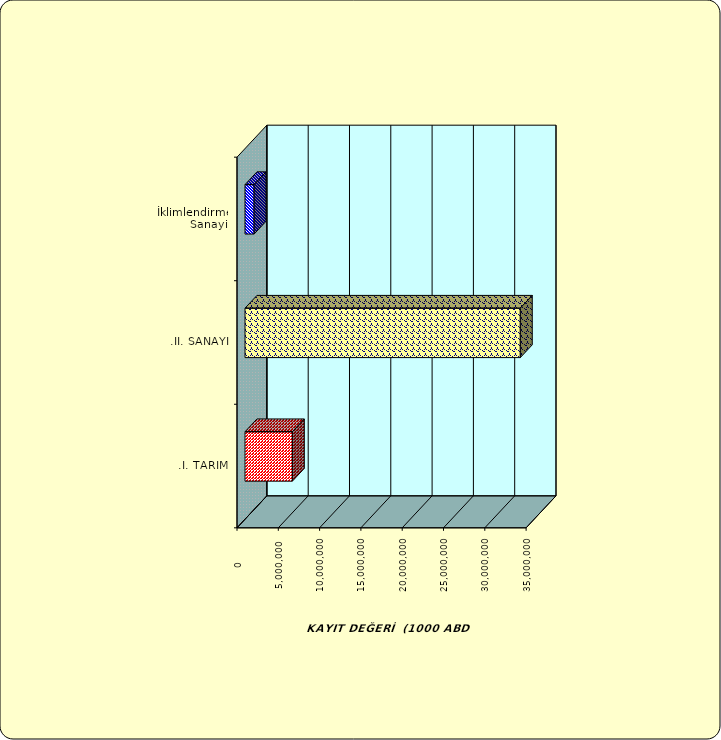
| Category | Series 0 |
|---|---|
| .I. TARIM | 5732055.577 |
| .II. SANAYİ | 33326892.489 |
|  İklimlendirme Sanayii | 1101007.761 |